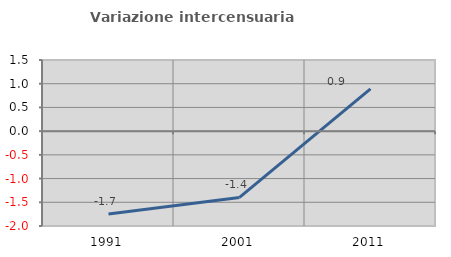
| Category | Variazione intercensuaria annua |
|---|---|
| 1991.0 | -1.748 |
| 2001.0 | -1.398 |
| 2011.0 | 0.89 |